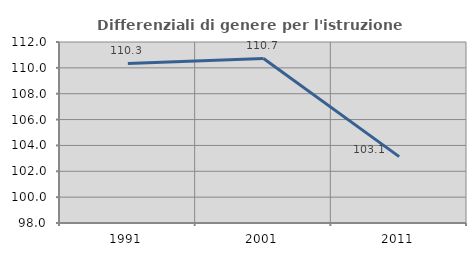
| Category | Differenziali di genere per l'istruzione superiore |
|---|---|
| 1991.0 | 110.342 |
| 2001.0 | 110.729 |
| 2011.0 | 103.132 |